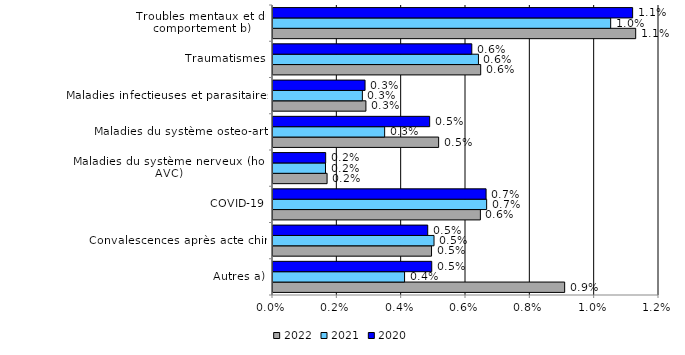
| Category | 2022 | 2021 | 2020 |
|---|---|---|---|
| Autres a) | 0.009 | 0.004 | 0.005 |
| Convalescences après acte chir. | 0.005 | 0.005 | 0.005 |
| COVID-19 | 0.006 | 0.007 | 0.007 |
| Maladies du système nerveux (hors AVC) | 0.002 | 0.002 | 0.002 |
| Maladies du système osteo-art. | 0.005 | 0.003 | 0.005 |
| Maladies infectieuses et parasitaires | 0.003 | 0.003 | 0.003 |
| Traumatismes | 0.006 | 0.006 | 0.006 |
| Troubles mentaux et du comportement b) | 0.011 | 0.01 | 0.011 |